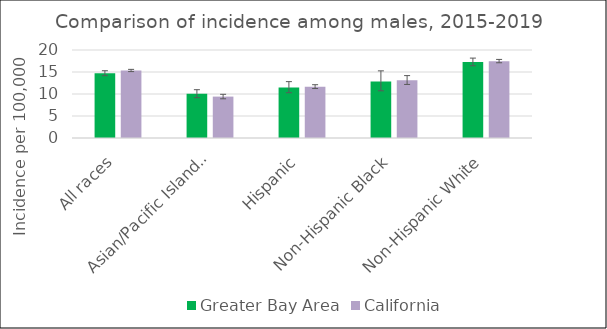
| Category | Greater Bay Area | California | SEER 18 |
|---|---|---|---|
| All races | 14.71 | 15.34 |  |
| Asian/Pacific Islander | 10.04 | 9.41 |  |
| Hispanic | 11.5 | 11.67 |  |
| Non-Hispanic Black | 12.85 | 13.15 |  |
| Non-Hispanic White | 17.27 | 17.47 |  |